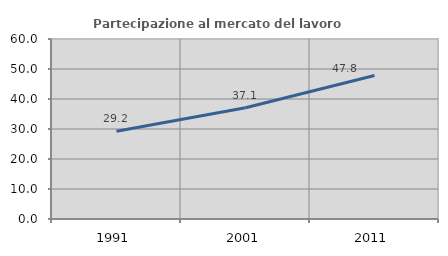
| Category | Partecipazione al mercato del lavoro  femminile |
|---|---|
| 1991.0 | 29.223 |
| 2001.0 | 37.079 |
| 2011.0 | 47.835 |